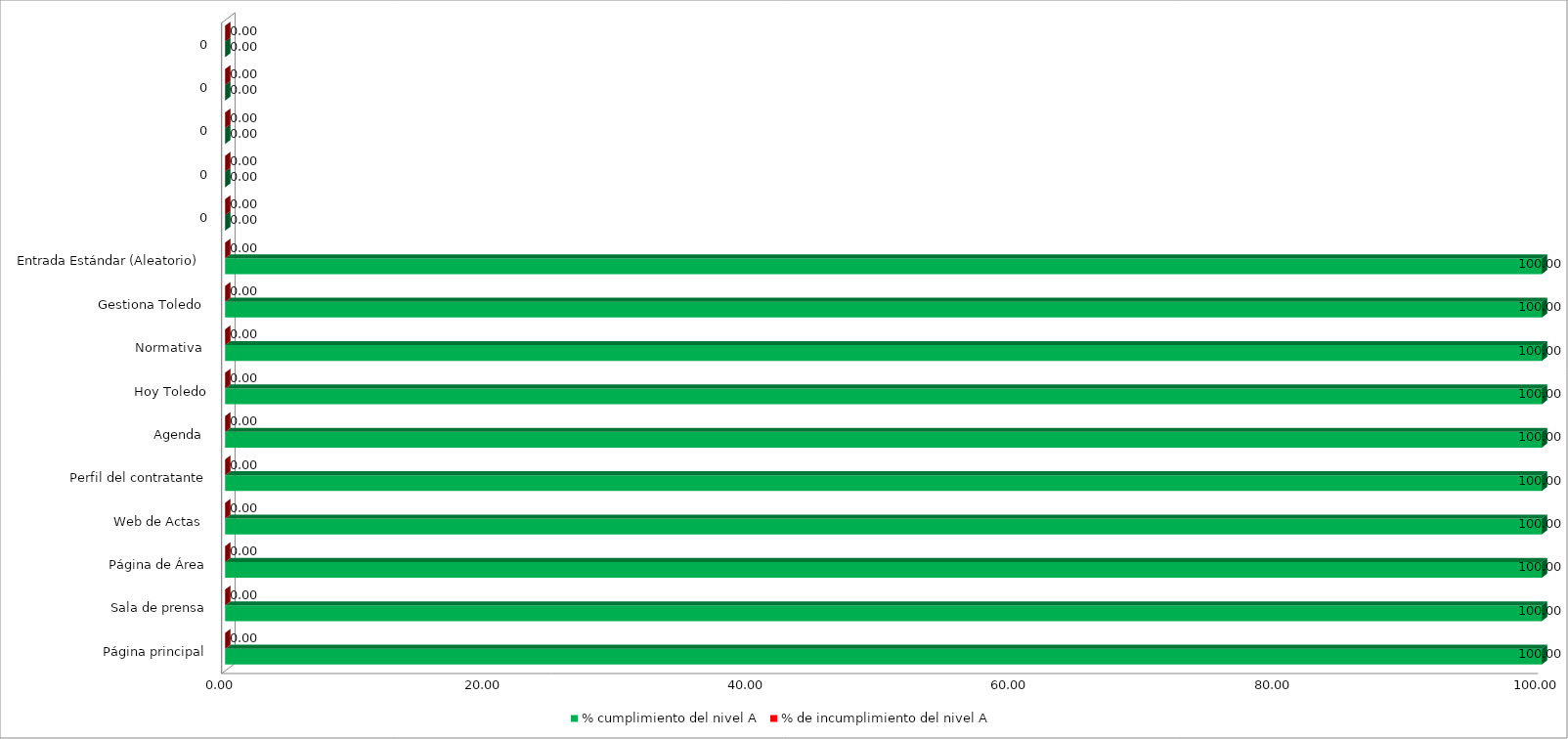
| Category | % cumplimiento del nivel A | % de incumplimiento del nivel A |
|---|---|---|
| Página principal | 100 | 0 |
| Sala de prensa | 100 | 0 |
| Página de Área | 100 | 0 |
| Web de Actas  | 100 | 0 |
| Perfil del contratante | 100 | 0 |
| Agenda  | 100 | 0 |
| Hoy Toledo | 100 | 0 |
| Normativa  | 100 | 0 |
| Gestiona Toledo  | 100 | 0 |
| Entrada Estándar (Aleatorio)  | 100 | 0 |
| 0 | 0 | 0 |
| 0 | 0 | 0 |
| 0 | 0 | 0 |
| 0 | 0 | 0 |
| 0 | 0 | 0 |